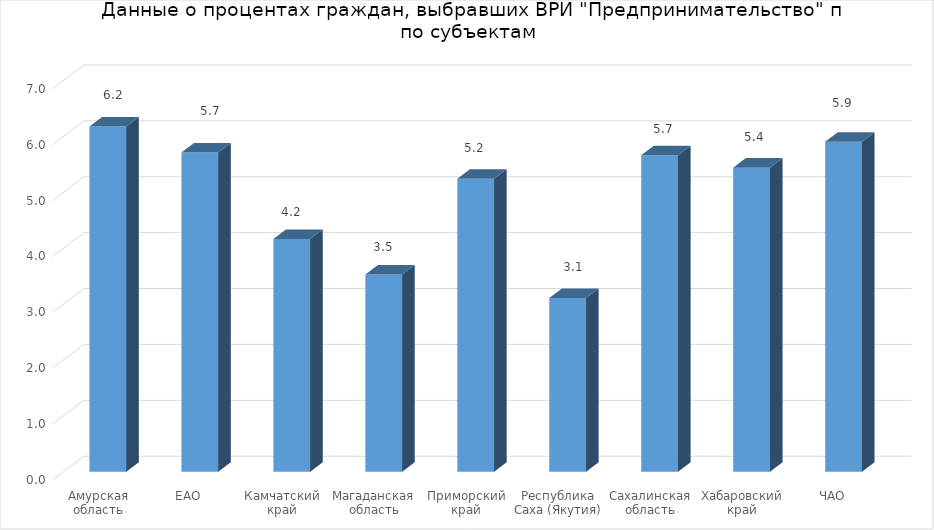
| Category | предпринимательство |
|---|---|
| Амурская область | 6.18 |
| ЕАО | 5.714 |
| Камчатский край | 4.167 |
| Магаданская область | 3.531 |
| Приморский край | 5.242 |
| Республика Саха (Якутия) | 3.107 |
| Сахалинская область | 5.662 |
| Хабаровский край | 5.442 |
| ЧАО | 5.906 |